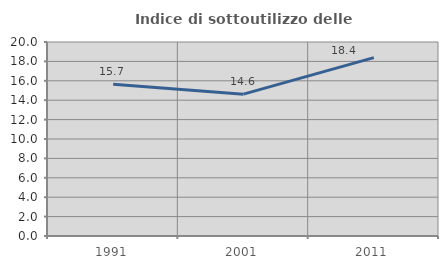
| Category | Indice di sottoutilizzo delle abitazioni  |
|---|---|
| 1991.0 | 15.657 |
| 2001.0 | 14.624 |
| 2011.0 | 18.391 |